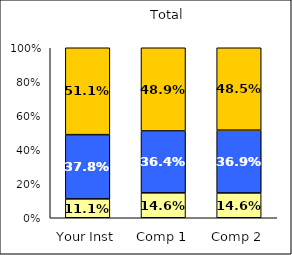
| Category | Low Social Agency | Average Social Agency | High Social Agency |
|---|---|---|---|
| Your Inst | 0.111 | 0.378 | 0.511 |
| Comp 1 | 0.146 | 0.364 | 0.489 |
| Comp 2 | 0.146 | 0.369 | 0.485 |